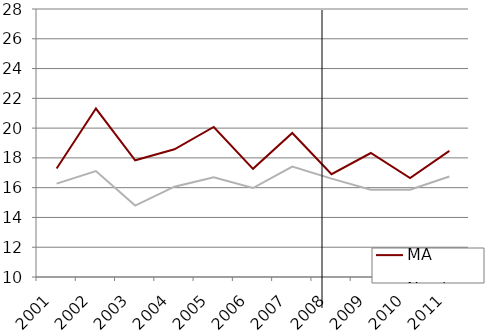
| Category | MA | Northeast |
|---|---|---|
| 2001.0 | 17.292 | 16.272 |
| 2002.0 | 21.312 | 17.117 |
| 2003.0 | 17.84 | 14.795 |
| 2004.0 | 18.58 | 16.064 |
| 2005.0 | 20.078 | 16.691 |
| 2006.0 | 17.266 | 15.976 |
| 2007.0 | 19.675 | 17.419 |
| 2008.0 | 16.908 | 16.609 |
| 2009.0 | 18.328 | 15.868 |
| 2010.0 | 16.641 | 15.859 |
| 2011.0 | 18.472 | 16.753 |